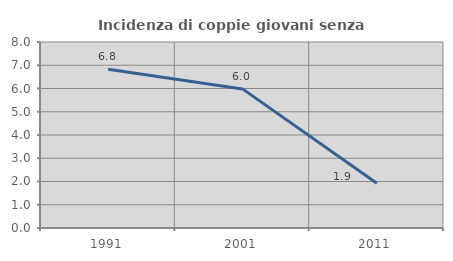
| Category | Incidenza di coppie giovani senza figli |
|---|---|
| 1991.0 | 6.826 |
| 2001.0 | 5.983 |
| 2011.0 | 1.923 |